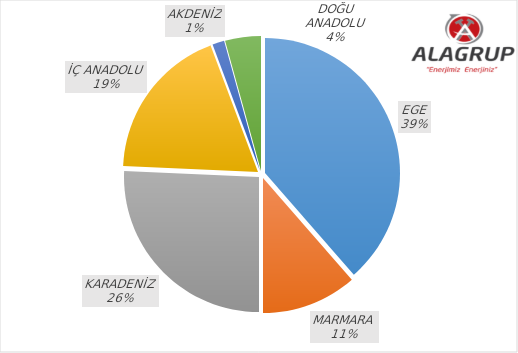
| Category | Series 0 |
|---|---|
| EGE | 27 |
| MARMARA | 8 |
| KARADENİZ | 18 |
| İÇ ANADOLU | 13 |
| AKDENİZ | 1 |
| DOĞU ANADOLU | 3 |